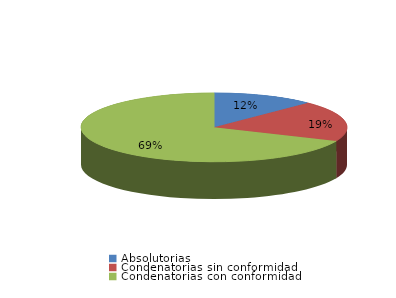
| Category | Series 0 |
|---|---|
| Absolutorias | 168 |
| Condenatorias sin conformidad | 259 |
| Condenatorias con conformidad | 930 |